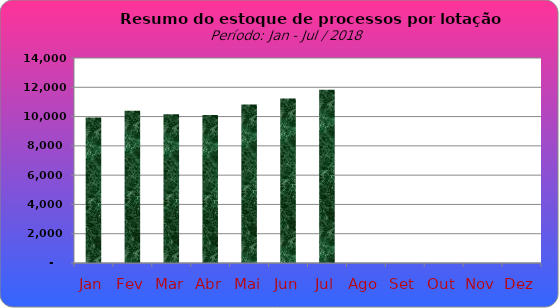
| Category | Series 0 |
|---|---|
| Jan | 9933 |
| Fev | 10393 |
| Mar | 10166 |
| Abr | 10112 |
| Mai | 10819 |
| Jun | 11230 |
| Jul | 11829 |
| Ago | 0 |
| Set | 0 |
| Out | 0 |
| Nov | 0 |
| Dez | 0 |